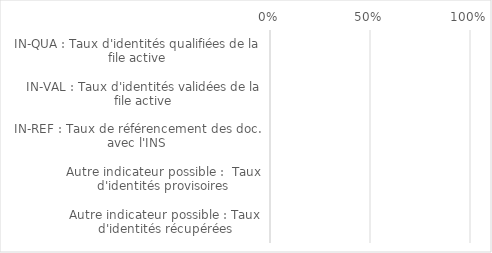
| Category | Series 0 |
|---|---|
| IN-QUA : Taux d'identités qualifiées de la file active | 0 |
| IN-VAL : Taux d'identités validées de la file active | 0 |
| IN-REF : Taux de référencement des doc. avec l'INS | 0 |
| Autre indicateur possible :  Taux d'identités provisoires | 0 |
| Autre indicateur possible : Taux d'identités récupérées | 0 |